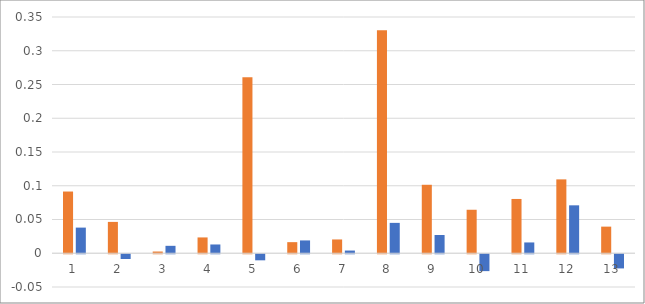
| Category | Orange | Blue |
|---|---|---|
| 0 | 0.091 | 0.038 |
| 1 | 0.046 | -0.007 |
| 2 | 0.003 | 0.011 |
| 3 | 0.023 | 0.013 |
| 4 | 0.261 | -0.009 |
| 5 | 0.016 | 0.019 |
| 6 | 0.02 | 0.004 |
| 7 | 0.33 | 0.045 |
| 8 | 0.101 | 0.027 |
| 9 | 0.064 | -0.025 |
| 10 | 0.08 | 0.016 |
| 11 | 0.109 | 0.071 |
| 12 | 0.039 | -0.021 |